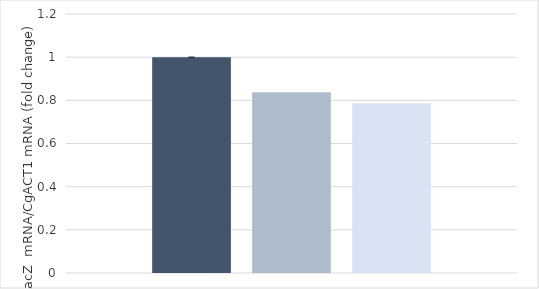
| Category | promAWP13 | promAWP13+mut632 | promAWP13+mut632+mut159 |
|---|---|---|---|
| 0 | 1 | 0.838 | 0.786 |